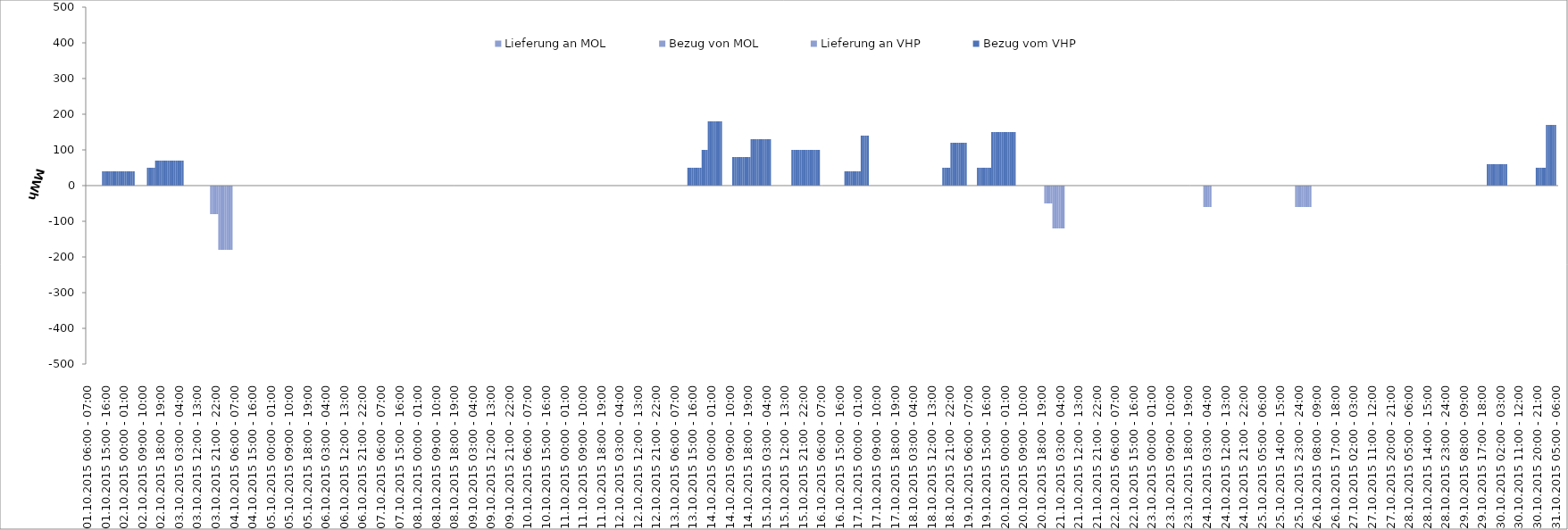
| Category | Bezug vom VHP | Lieferung an VHP | Bezug von MOL | Lieferung an MOL |
|---|---|---|---|---|
| 01.10.2015 06:00 - 07:00 | 0 | 0 | 0 | 0 |
| 01.10.2015 07:00 - 08:00 | 0 | 0 | 0 | 0 |
| 01.10.2015 08:00 - 09:00 | 0 | 0 | 0 | 0 |
| 01.10.2015 09:00 - 10:00 | 0 | 0 | 0 | 0 |
| 01.10.2015 10:00 - 11:00 | 0 | 0 | 0 | 0 |
| 01.10.2015 11:00 - 12:00 | 0 | 0 | 0 | 0 |
| 01.10.2015 12:00 - 13:00 | 0 | 0 | 0 | 0 |
| 01.10.2015 13:00 - 14:00 | 0 | 0 | 0 | 0 |
| 01.10.2015 14:00 - 15:00 | 40 | 0 | 0 | 0 |
| 01.10.2015 15:00 - 16:00 | 40 | 0 | 0 | 0 |
| 01.10.2015 16:00 - 17:00 | 40 | 0 | 0 | 0 |
| 01.10.2015 17:00 - 18:00 | 40 | 0 | 0 | 0 |
| 01.10.2015 18:00 - 19:00 | 40 | 0 | 0 | 0 |
| 01.10.2015 19:00 - 20:00 | 40 | 0 | 0 | 0 |
| 01.10.2015 20:00 - 21:00 | 40 | 0 | 0 | 0 |
| 01.10.2015 21:00 - 22:00 | 40 | 0 | 0 | 0 |
| 01.10.2015 22:00 - 23:00 | 40 | 0 | 0 | 0 |
| 01.10.2015 23:00 - 24:00 | 40 | 0 | 0 | 0 |
| 02.10.2015 00:00 - 01:00 | 40 | 0 | 0 | 0 |
| 02.10.2015 01:00 - 02:00 | 40 | 0 | 0 | 0 |
| 02.10.2015 02:00 - 03:00 | 40 | 0 | 0 | 0 |
| 02.10.2015 03:00 - 04:00 | 40 | 0 | 0 | 0 |
| 02.10.2015 04:00 - 05:00 | 40 | 0 | 0 | 0 |
| 02.10.2015 05:00 - 06:00 | 40 | 0 | 0 | 0 |
| 02.10.2015 06:00 - 07:00 | 0 | 0 | 0 | 0 |
| 02.10.2015 07:00 - 08:00 | 0 | 0 | 0 | 0 |
| 02.10.2015 08:00 - 09:00 | 0 | 0 | 0 | 0 |
| 02.10.2015 09:00 - 10:00 | 0 | 0 | 0 | 0 |
| 02.10.2015 10:00 - 11:00 | 0 | 0 | 0 | 0 |
| 02.10.2015 11:00 - 12:00 | 0 | 0 | 0 | 0 |
| 02.10.2015 12:00 - 13:00 | 50 | 0 | 0 | 0 |
| 02.10.2015 13:00 - 14:00 | 50 | 0 | 0 | 0 |
| 02.10.2015 14:00 - 15:00 | 50 | 0 | 0 | 0 |
| 02.10.2015 15:00 - 16:00 | 50 | 0 | 0 | 0 |
| 02.10.2015 16:00 - 17:00 | 70 | 0 | 0 | 0 |
| 02.10.2015 17:00 - 18:00 | 70 | 0 | 0 | 0 |
| 02.10.2015 18:00 - 19:00 | 70 | 0 | 0 | 0 |
| 02.10.2015 19:00 - 20:00 | 70 | 0 | 0 | 0 |
| 02.10.2015 20:00 - 21:00 | 70 | 0 | 0 | 0 |
| 02.10.2015 21:00 - 22:00 | 70 | 0 | 0 | 0 |
| 02.10.2015 22:00 - 23:00 | 70 | 0 | 0 | 0 |
| 02.10.2015 23:00 - 24:00 | 70 | 0 | 0 | 0 |
| 03.10.2015 00:00 - 01:00 | 70 | 0 | 0 | 0 |
| 03.10.2015 01:00 - 02:00 | 70 | 0 | 0 | 0 |
| 03.10.2015 02:00 - 03:00 | 70 | 0 | 0 | 0 |
| 03.10.2015 03:00 - 04:00 | 70 | 0 | 0 | 0 |
| 03.10.2015 04:00 - 05:00 | 70 | 0 | 0 | 0 |
| 03.10.2015 05:00 - 06:00 | 70 | 0 | 0 | 0 |
| 03.10.2015 06:00 - 07:00 | 0 | 0 | 0 | 0 |
| 03.10.2015 07:00 - 08:00 | 0 | 0 | 0 | 0 |
| 03.10.2015 08:00 - 09:00 | 0 | 0 | 0 | 0 |
| 03.10.2015 09:00 - 10:00 | 0 | 0 | 0 | 0 |
| 03.10.2015 10:00 - 11:00 | 0 | 0 | 0 | 0 |
| 03.10.2015 11:00 - 12:00 | 0 | 0 | 0 | 0 |
| 03.10.2015 12:00 - 13:00 | 0 | 0 | 0 | 0 |
| 03.10.2015 13:00 - 14:00 | 0 | 0 | 0 | 0 |
| 03.10.2015 14:00 - 15:00 | 0 | 0 | 0 | 0 |
| 03.10.2015 15:00 - 16:00 | 0 | 0 | 0 | 0 |
| 03.10.2015 16:00 - 17:00 | 0 | 0 | 0 | 0 |
| 03.10.2015 17:00 - 18:00 | 0 | 0 | 0 | 0 |
| 03.10.2015 18:00 - 19:00 | 0 | 0 | 0 | 0 |
| 03.10.2015 19:00 - 20:00 | 0 | -80 | 0 | 0 |
| 03.10.2015 20:00 - 21:00 | 0 | -80 | 0 | 0 |
| 03.10.2015 21:00 - 22:00 | 0 | -80 | 0 | 0 |
| 03.10.2015 22:00 - 23:00 | 0 | -80 | 0 | 0 |
| 03.10.2015 23:00 - 24:00 | 0 | -180 | 0 | 0 |
| 04.10.2015 00:00 - 01:00 | 0 | -180 | 0 | 0 |
| 04.10.2015 01:00 - 02:00 | 0 | -180 | 0 | 0 |
| 04.10.2015 02:00 - 03:00 | 0 | -180 | 0 | 0 |
| 04.10.2015 03:00 - 04:00 | 0 | -180 | 0 | 0 |
| 04.10.2015 04:00 - 05:00 | 0 | -180 | 0 | 0 |
| 04.10.2015 05:00 - 06:00 | 0 | -180 | 0 | 0 |
| 04.10.2015 06:00 - 07:00 | 0 | 0 | 0 | 0 |
| 04.10.2015 07:00 - 08:00 | 0 | 0 | 0 | 0 |
| 04.10.2015 08:00 - 09:00 | 0 | 0 | 0 | 0 |
| 04.10.2015 09:00 - 10:00 | 0 | 0 | 0 | 0 |
| 04.10.2015 10:00 - 11:00 | 0 | 0 | 0 | 0 |
| 04.10.2015 11:00 - 12:00 | 0 | 0 | 0 | 0 |
| 04.10.2015 12:00 - 13:00 | 0 | 0 | 0 | 0 |
| 04.10.2015 13:00 - 14:00 | 0 | 0 | 0 | 0 |
| 04.10.2015 14:00 - 15:00 | 0 | 0 | 0 | 0 |
| 04.10.2015 15:00 - 16:00 | 0 | 0 | 0 | 0 |
| 04.10.2015 16:00 - 17:00 | 0 | 0 | 0 | 0 |
| 04.10.2015 17:00 - 18:00 | 0 | 0 | 0 | 0 |
| 04.10.2015 18:00 - 19:00 | 0 | 0 | 0 | 0 |
| 04.10.2015 19:00 - 20:00 | 0 | 0 | 0 | 0 |
| 04.10.2015 20:00 - 21:00 | 0 | 0 | 0 | 0 |
| 04.10.2015 21:00 - 22:00 | 0 | 0 | 0 | 0 |
| 04.10.2015 22:00 - 23:00 | 0 | 0 | 0 | 0 |
| 04.10.2015 23:00 - 24:00 | 0 | 0 | 0 | 0 |
| 05.10.2015 00:00 - 01:00 | 0 | 0 | 0 | 0 |
| 05.10.2015 01:00 - 02:00 | 0 | 0 | 0 | 0 |
| 05.10.2015 02:00 - 03:00 | 0 | 0 | 0 | 0 |
| 05.10.2015 03:00 - 04:00 | 0 | 0 | 0 | 0 |
| 05.10.2015 04:00 - 05:00 | 0 | 0 | 0 | 0 |
| 05.10.2015 05:00 - 06:00 | 0 | 0 | 0 | 0 |
| 05.10.2015 06:00 - 07:00 | 0 | 0 | 0 | 0 |
| 05.10.2015 07:00 - 08:00 | 0 | 0 | 0 | 0 |
| 05.10.2015 08:00 - 09:00 | 0 | 0 | 0 | 0 |
| 05.10.2015 09:00 - 10:00 | 0 | 0 | 0 | 0 |
| 05.10.2015 10:00 - 11:00 | 0 | 0 | 0 | 0 |
| 05.10.2015 11:00 - 12:00 | 0 | 0 | 0 | 0 |
| 05.10.2015 12:00 - 13:00 | 0 | 0 | 0 | 0 |
| 05.10.2015 13:00 - 14:00 | 0 | 0 | 0 | 0 |
| 05.10.2015 14:00 - 15:00 | 0 | 0 | 0 | 0 |
| 05.10.2015 15:00 - 16:00 | 0 | 0 | 0 | 0 |
| 05.10.2015 16:00 - 17:00 | 0 | 0 | 0 | 0 |
| 05.10.2015 17:00 - 18:00 | 0 | 0 | 0 | 0 |
| 05.10.2015 18:00 - 19:00 | 0 | 0 | 0 | 0 |
| 05.10.2015 19:00 - 20:00 | 0 | 0 | 0 | 0 |
| 05.10.2015 20:00 - 21:00 | 0 | 0 | 0 | 0 |
| 05.10.2015 21:00 - 22:00 | 0 | 0 | 0 | 0 |
| 05.10.2015 22:00 - 23:00 | 0 | 0 | 0 | 0 |
| 05.10.2015 23:00 - 24:00 | 0 | 0 | 0 | 0 |
| 06.10.2015 00:00 - 01:00 | 0 | 0 | 0 | 0 |
| 06.10.2015 01:00 - 02:00 | 0 | 0 | 0 | 0 |
| 06.10.2015 02:00 - 03:00 | 0 | 0 | 0 | 0 |
| 06.10.2015 03:00 - 04:00 | 0 | 0 | 0 | 0 |
| 06.10.2015 04:00 - 05:00 | 0 | 0 | 0 | 0 |
| 06.10.2015 05:00 - 06:00 | 0 | 0 | 0 | 0 |
| 06.10.2015 06:00 - 07:00 | 0 | 0 | 0 | 0 |
| 06.10.2015 07:00 - 08:00 | 0 | 0 | 0 | 0 |
| 06.10.2015 08:00 - 09:00 | 0 | 0 | 0 | 0 |
| 06.10.2015 09:00 - 10:00 | 0 | 0 | 0 | 0 |
| 06.10.2015 10:00 - 11:00 | 0 | 0 | 0 | 0 |
| 06.10.2015 11:00 - 12:00 | 0 | 0 | 0 | 0 |
| 06.10.2015 12:00 - 13:00 | 0 | 0 | 0 | 0 |
| 06.10.2015 13:00 - 14:00 | 0 | 0 | 0 | 0 |
| 06.10.2015 14:00 - 15:00 | 0 | 0 | 0 | 0 |
| 06.10.2015 15:00 - 16:00 | 0 | 0 | 0 | 0 |
| 06.10.2015 16:00 - 17:00 | 0 | 0 | 0 | 0 |
| 06.10.2015 17:00 - 18:00 | 0 | 0 | 0 | 0 |
| 06.10.2015 18:00 - 19:00 | 0 | 0 | 0 | 0 |
| 06.10.2015 19:00 - 20:00 | 0 | 0 | 0 | 0 |
| 06.10.2015 20:00 - 21:00 | 0 | 0 | 0 | 0 |
| 06.10.2015 21:00 - 22:00 | 0 | 0 | 0 | 0 |
| 06.10.2015 22:00 - 23:00 | 0 | 0 | 0 | 0 |
| 06.10.2015 23:00 - 24:00 | 0 | 0 | 0 | 0 |
| 07.10.2015 00:00 - 01:00 | 0 | 0 | 0 | 0 |
| 07.10.2015 01:00 - 02:00 | 0 | 0 | 0 | 0 |
| 07.10.2015 02:00 - 03:00 | 0 | 0 | 0 | 0 |
| 07.10.2015 03:00 - 04:00 | 0 | 0 | 0 | 0 |
| 07.10.2015 04:00 - 05:00 | 0 | 0 | 0 | 0 |
| 07.10.2015 05:00 - 06:00 | 0 | 0 | 0 | 0 |
| 07.10.2015 06:00 - 07:00 | 0 | 0 | 0 | 0 |
| 07.10.2015 07:00 - 08:00 | 0 | 0 | 0 | 0 |
| 07.10.2015 08:00 - 09:00 | 0 | 0 | 0 | 0 |
| 07.10.2015 09:00 - 10:00 | 0 | 0 | 0 | 0 |
| 07.10.2015 10:00 - 11:00 | 0 | 0 | 0 | 0 |
| 07.10.2015 11:00 - 12:00 | 0 | 0 | 0 | 0 |
| 07.10.2015 12:00 - 13:00 | 0 | 0 | 0 | 0 |
| 07.10.2015 13:00 - 14:00 | 0 | 0 | 0 | 0 |
| 07.10.2015 14:00 - 15:00 | 0 | 0 | 0 | 0 |
| 07.10.2015 15:00 - 16:00 | 0 | 0 | 0 | 0 |
| 07.10.2015 16:00 - 17:00 | 0 | 0 | 0 | 0 |
| 07.10.2015 17:00 - 18:00 | 0 | 0 | 0 | 0 |
| 07.10.2015 18:00 - 19:00 | 0 | 0 | 0 | 0 |
| 07.10.2015 19:00 - 20:00 | 0 | 0 | 0 | 0 |
| 07.10.2015 20:00 - 21:00 | 0 | 0 | 0 | 0 |
| 07.10.2015 21:00 - 22:00 | 0 | 0 | 0 | 0 |
| 07.10.2015 22:00 - 23:00 | 0 | 0 | 0 | 0 |
| 07.10.2015 23:00 - 24:00 | 0 | 0 | 0 | 0 |
| 08.10.2015 00:00 - 01:00 | 0 | 0 | 0 | 0 |
| 08.10.2015 01:00 - 02:00 | 0 | 0 | 0 | 0 |
| 08.10.2015 02:00 - 03:00 | 0 | 0 | 0 | 0 |
| 08.10.2015 03:00 - 04:00 | 0 | 0 | 0 | 0 |
| 08.10.2015 04:00 - 05:00 | 0 | 0 | 0 | 0 |
| 08.10.2015 05:00 - 06:00 | 0 | 0 | 0 | 0 |
| 08.10.2015 06:00 - 07:00 | 0 | 0 | 0 | 0 |
| 08.10.2015 07:00 - 08:00 | 0 | 0 | 0 | 0 |
| 08.10.2015 08:00 - 09:00 | 0 | 0 | 0 | 0 |
| 08.10.2015 09:00 - 10:00 | 0 | 0 | 0 | 0 |
| 08.10.2015 10:00 - 11:00 | 0 | 0 | 0 | 0 |
| 08.10.2015 11:00 - 12:00 | 0 | 0 | 0 | 0 |
| 08.10.2015 12:00 - 13:00 | 0 | 0 | 0 | 0 |
| 08.10.2015 13:00 - 14:00 | 0 | 0 | 0 | 0 |
| 08.10.2015 14:00 - 15:00 | 0 | 0 | 0 | 0 |
| 08.10.2015 15:00 - 16:00 | 0 | 0 | 0 | 0 |
| 08.10.2015 16:00 - 17:00 | 0 | 0 | 0 | 0 |
| 08.10.2015 17:00 - 18:00 | 0 | 0 | 0 | 0 |
| 08.10.2015 18:00 - 19:00 | 0 | 0 | 0 | 0 |
| 08.10.2015 19:00 - 20:00 | 0 | 0 | 0 | 0 |
| 08.10.2015 20:00 - 21:00 | 0 | 0 | 0 | 0 |
| 08.10.2015 21:00 - 22:00 | 0 | 0 | 0 | 0 |
| 08.10.2015 22:00 - 23:00 | 0 | 0 | 0 | 0 |
| 08.10.2015 23:00 - 24:00 | 0 | 0 | 0 | 0 |
| 09.10.2015 00:00 - 01:00 | 0 | 0 | 0 | 0 |
| 09.10.2015 01:00 - 02:00 | 0 | 0 | 0 | 0 |
| 09.10.2015 02:00 - 03:00 | 0 | 0 | 0 | 0 |
| 09.10.2015 03:00 - 04:00 | 0 | 0 | 0 | 0 |
| 09.10.2015 04:00 - 05:00 | 0 | 0 | 0 | 0 |
| 09.10.2015 05:00 - 06:00 | 0 | 0 | 0 | 0 |
| 09.10.2015 06:00 - 07:00 | 0 | 0 | 0 | 0 |
| 09.10.2015 07:00 - 08:00 | 0 | 0 | 0 | 0 |
| 09.10.2015 08:00 - 09:00 | 0 | 0 | 0 | 0 |
| 09.10.2015 09:00 - 10:00 | 0 | 0 | 0 | 0 |
| 09.10.2015 10:00 - 11:00 | 0 | 0 | 0 | 0 |
| 09.10.2015 11:00 - 12:00 | 0 | 0 | 0 | 0 |
| 09.10.2015 12:00 - 13:00 | 0 | 0 | 0 | 0 |
| 09.10.2015 13:00 - 14:00 | 0 | 0 | 0 | 0 |
| 09.10.2015 14:00 - 15:00 | 0 | 0 | 0 | 0 |
| 09.10.2015 15:00 - 16:00 | 0 | 0 | 0 | 0 |
| 09.10.2015 16:00 - 17:00 | 0 | 0 | 0 | 0 |
| 09.10.2015 17:00 - 18:00 | 0 | 0 | 0 | 0 |
| 09.10.2015 18:00 - 19:00 | 0 | 0 | 0 | 0 |
| 09.10.2015 19:00 - 20:00 | 0 | 0 | 0 | 0 |
| 09.10.2015 20:00 - 21:00 | 0 | 0 | 0 | 0 |
| 09.10.2015 21:00 - 22:00 | 0 | 0 | 0 | 0 |
| 09.10.2015 22:00 - 23:00 | 0 | 0 | 0 | 0 |
| 09.10.2015 23:00 - 24:00 | 0 | 0 | 0 | 0 |
| 10.10.2015 00:00 - 01:00 | 0 | 0 | 0 | 0 |
| 10.10.2015 01:00 - 02:00 | 0 | 0 | 0 | 0 |
| 10.10.2015 02:00 - 03:00 | 0 | 0 | 0 | 0 |
| 10.10.2015 03:00 - 04:00 | 0 | 0 | 0 | 0 |
| 10.10.2015 04:00 - 05:00 | 0 | 0 | 0 | 0 |
| 10.10.2015 05:00 - 06:00 | 0 | 0 | 0 | 0 |
| 10.10.2015 06:00 - 07:00 | 0 | 0 | 0 | 0 |
| 10.10.2015 07:00 - 08:00 | 0 | 0 | 0 | 0 |
| 10.10.2015 08:00 - 09:00 | 0 | 0 | 0 | 0 |
| 10.10.2015 09:00 - 10:00 | 0 | 0 | 0 | 0 |
| 10.10.2015 10:00 - 11:00 | 0 | 0 | 0 | 0 |
| 10.10.2015 11:00 - 12:00 | 0 | 0 | 0 | 0 |
| 10.10.2015 12:00 - 13:00 | 0 | 0 | 0 | 0 |
| 10.10.2015 13:00 - 14:00 | 0 | 0 | 0 | 0 |
| 10.10.2015 14:00 - 15:00 | 0 | 0 | 0 | 0 |
| 10.10.2015 15:00 - 16:00 | 0 | 0 | 0 | 0 |
| 10.10.2015 16:00 - 17:00 | 0 | 0 | 0 | 0 |
| 10.10.2015 17:00 - 18:00 | 0 | 0 | 0 | 0 |
| 10.10.2015 18:00 - 19:00 | 0 | 0 | 0 | 0 |
| 10.10.2015 19:00 - 20:00 | 0 | 0 | 0 | 0 |
| 10.10.2015 20:00 - 21:00 | 0 | 0 | 0 | 0 |
| 10.10.2015 21:00 - 22:00 | 0 | 0 | 0 | 0 |
| 10.10.2015 22:00 - 23:00 | 0 | 0 | 0 | 0 |
| 10.10.2015 23:00 - 24:00 | 0 | 0 | 0 | 0 |
| 11.10.2015 00:00 - 01:00 | 0 | 0 | 0 | 0 |
| 11.10.2015 01:00 - 02:00 | 0 | 0 | 0 | 0 |
| 11.10.2015 02:00 - 03:00 | 0 | 0 | 0 | 0 |
| 11.10.2015 03:00 - 04:00 | 0 | 0 | 0 | 0 |
| 11.10.2015 04:00 - 05:00 | 0 | 0 | 0 | 0 |
| 11.10.2015 05:00 - 06:00 | 0 | 0 | 0 | 0 |
| 11.10.2015 06:00 - 07:00 | 0 | 0 | 0 | 0 |
| 11.10.2015 07:00 - 08:00 | 0 | 0 | 0 | 0 |
| 11.10.2015 08:00 - 09:00 | 0 | 0 | 0 | 0 |
| 11.10.2015 09:00 - 10:00 | 0 | 0 | 0 | 0 |
| 11.10.2015 10:00 - 11:00 | 0 | 0 | 0 | 0 |
| 11.10.2015 11:00 - 12:00 | 0 | 0 | 0 | 0 |
| 11.10.2015 12:00 - 13:00 | 0 | 0 | 0 | 0 |
| 11.10.2015 13:00 - 14:00 | 0 | 0 | 0 | 0 |
| 11.10.2015 14:00 - 15:00 | 0 | 0 | 0 | 0 |
| 11.10.2015 15:00 - 16:00 | 0 | 0 | 0 | 0 |
| 11.10.2015 16:00 - 17:00 | 0 | 0 | 0 | 0 |
| 11.10.2015 17:00 - 18:00 | 0 | 0 | 0 | 0 |
| 11.10.2015 18:00 - 19:00 | 0 | 0 | 0 | 0 |
| 11.10.2015 19:00 - 20:00 | 0 | 0 | 0 | 0 |
| 11.10.2015 20:00 - 21:00 | 0 | 0 | 0 | 0 |
| 11.10.2015 21:00 - 22:00 | 0 | 0 | 0 | 0 |
| 11.10.2015 22:00 - 23:00 | 0 | 0 | 0 | 0 |
| 11.10.2015 23:00 - 24:00 | 0 | 0 | 0 | 0 |
| 12.10.2015 00:00 - 01:00 | 0 | 0 | 0 | 0 |
| 12.10.2015 01:00 - 02:00 | 0 | 0 | 0 | 0 |
| 12.10.2015 02:00 - 03:00 | 0 | 0 | 0 | 0 |
| 12.10.2015 03:00 - 04:00 | 0 | 0 | 0 | 0 |
| 12.10.2015 04:00 - 05:00 | 0 | 0 | 0 | 0 |
| 12.10.2015 05:00 - 06:00 | 0 | 0 | 0 | 0 |
| 12.10.2015 06:00 - 07:00 | 0 | 0 | 0 | 0 |
| 12.10.2015 07:00 - 08:00 | 0 | 0 | 0 | 0 |
| 12.10.2015 08:00 - 09:00 | 0 | 0 | 0 | 0 |
| 12.10.2015 09:00 - 10:00 | 0 | 0 | 0 | 0 |
| 12.10.2015 10:00 - 11:00 | 0 | 0 | 0 | 0 |
| 12.10.2015 11:00 - 12:00 | 0 | 0 | 0 | 0 |
| 12.10.2015 12:00 - 13:00 | 0 | 0 | 0 | 0 |
| 12.10.2015 13:00 - 14:00 | 0 | 0 | 0 | 0 |
| 12.10.2015 14:00 - 15:00 | 0 | 0 | 0 | 0 |
| 12.10.2015 15:00 - 16:00 | 0 | 0 | 0 | 0 |
| 12.10.2015 16:00 - 17:00 | 0 | 0 | 0 | 0 |
| 12.10.2015 17:00 - 18:00 | 0 | 0 | 0 | 0 |
| 12.10.2015 18:00 - 19:00 | 0 | 0 | 0 | 0 |
| 12.10.2015 19:00 - 20:00 | 0 | 0 | 0 | 0 |
| 12.10.2015 20:00 - 21:00 | 0 | 0 | 0 | 0 |
| 12.10.2015 21:00 - 22:00 | 0 | 0 | 0 | 0 |
| 12.10.2015 22:00 - 23:00 | 0 | 0 | 0 | 0 |
| 12.10.2015 23:00 - 24:00 | 0 | 0 | 0 | 0 |
| 13.10.2015 00:00 - 01:00 | 0 | 0 | 0 | 0 |
| 13.10.2015 01:00 - 02:00 | 0 | 0 | 0 | 0 |
| 13.10.2015 02:00 - 03:00 | 0 | 0 | 0 | 0 |
| 13.10.2015 03:00 - 04:00 | 0 | 0 | 0 | 0 |
| 13.10.2015 04:00 - 05:00 | 0 | 0 | 0 | 0 |
| 13.10.2015 05:00 - 06:00 | 0 | 0 | 0 | 0 |
| 13.10.2015 06:00 - 07:00 | 0 | 0 | 0 | 0 |
| 13.10.2015 07:00 - 08:00 | 0 | 0 | 0 | 0 |
| 13.10.2015 08:00 - 09:00 | 0 | 0 | 0 | 0 |
| 13.10.2015 09:00 - 10:00 | 0 | 0 | 0 | 0 |
| 13.10.2015 10:00 - 11:00 | 0 | 0 | 0 | 0 |
| 13.10.2015 11:00 - 12:00 | 0 | 0 | 0 | 0 |
| 13.10.2015 12:00 - 13:00 | 0 | 0 | 0 | 0 |
| 13.10.2015 13:00 - 14:00 | 50 | 0 | 0 | 0 |
| 13.10.2015 14:00 - 15:00 | 50 | 0 | 0 | 0 |
| 13.10.2015 15:00 - 16:00 | 50 | 0 | 0 | 0 |
| 13.10.2015 16:00 - 17:00 | 50 | 0 | 0 | 0 |
| 13.10.2015 17:00 - 18:00 | 50 | 0 | 0 | 0 |
| 13.10.2015 18:00 - 19:00 | 50 | 0 | 0 | 0 |
| 13.10.2015 19:00 - 20:00 | 50 | 0 | 0 | 0 |
| 13.10.2015 20:00 - 21:00 | 100 | 0 | 0 | 0 |
| 13.10.2015 21:00 - 22:00 | 100 | 0 | 0 | 0 |
| 13.10.2015 22:00 - 23:00 | 100 | 0 | 0 | 0 |
| 13.10.2015 23:00 - 24:00 | 180 | 0 | 0 | 0 |
| 14.10.2015 00:00 - 01:00 | 180 | 0 | 0 | 0 |
| 14.10.2015 01:00 - 02:00 | 180 | 0 | 0 | 0 |
| 14.10.2015 02:00 - 03:00 | 180 | 0 | 0 | 0 |
| 14.10.2015 03:00 - 04:00 | 180 | 0 | 0 | 0 |
| 14.10.2015 04:00 - 05:00 | 180 | 0 | 0 | 0 |
| 14.10.2015 05:00 - 06:00 | 180 | 0 | 0 | 0 |
| 14.10.2015 06:00 - 07:00 | 0 | 0 | 0 | 0 |
| 14.10.2015 07:00 - 08:00 | 0 | 0 | 0 | 0 |
| 14.10.2015 08:00 - 09:00 | 0 | 0 | 0 | 0 |
| 14.10.2015 09:00 - 10:00 | 0 | 0 | 0 | 0 |
| 14.10.2015 10:00 - 11:00 | 0 | 0 | 0 | 0 |
| 14.10.2015 11:00 - 12:00 | 80 | 0 | 0 | 0 |
| 14.10.2015 12:00 - 13:00 | 80 | 0 | 0 | 0 |
| 14.10.2015 13:00 - 14:00 | 80 | 0 | 0 | 0 |
| 14.10.2015 14:00 - 15:00 | 80 | 0 | 0 | 0 |
| 14.10.2015 15:00 - 16:00 | 80 | 0 | 0 | 0 |
| 14.10.2015 16:00 - 17:00 | 80 | 0 | 0 | 0 |
| 14.10.2015 17:00 - 18:00 | 80 | 0 | 0 | 0 |
| 14.10.2015 18:00 - 19:00 | 80 | 0 | 0 | 0 |
| 14.10.2015 19:00 - 20:00 | 80 | 0 | 0 | 0 |
| 14.10.2015 20:00 - 21:00 | 130 | 0 | 0 | 0 |
| 14.10.2015 21:00 - 22:00 | 130 | 0 | 0 | 0 |
| 14.10.2015 22:00 - 23:00 | 130 | 0 | 0 | 0 |
| 14.10.2015 23:00 - 24:00 | 130 | 0 | 0 | 0 |
| 15.10.2015 00:00 - 01:00 | 130 | 0 | 0 | 0 |
| 15.10.2015 01:00 - 02:00 | 130 | 0 | 0 | 0 |
| 15.10.2015 02:00 - 03:00 | 130 | 0 | 0 | 0 |
| 15.10.2015 03:00 - 04:00 | 130 | 0 | 0 | 0 |
| 15.10.2015 04:00 - 05:00 | 130 | 0 | 0 | 0 |
| 15.10.2015 05:00 - 06:00 | 130 | 0 | 0 | 0 |
| 15.10.2015 06:00 - 07:00 | 0 | 0 | 0 | 0 |
| 15.10.2015 07:00 - 08:00 | 0 | 0 | 0 | 0 |
| 15.10.2015 08:00 - 09:00 | 0 | 0 | 0 | 0 |
| 15.10.2015 09:00 - 10:00 | 0 | 0 | 0 | 0 |
| 15.10.2015 10:00 - 11:00 | 0 | 0 | 0 | 0 |
| 15.10.2015 11:00 - 12:00 | 0 | 0 | 0 | 0 |
| 15.10.2015 12:00 - 13:00 | 0 | 0 | 0 | 0 |
| 15.10.2015 13:00 - 14:00 | 0 | 0 | 0 | 0 |
| 15.10.2015 14:00 - 15:00 | 0 | 0 | 0 | 0 |
| 15.10.2015 15:00 - 16:00 | 0 | 0 | 0 | 0 |
| 15.10.2015 16:00 - 17:00 | 100 | 0 | 0 | 0 |
| 15.10.2015 17:00 - 18:00 | 100 | 0 | 0 | 0 |
| 15.10.2015 18:00 - 19:00 | 100 | 0 | 0 | 0 |
| 15.10.2015 19:00 - 20:00 | 100 | 0 | 0 | 0 |
| 15.10.2015 20:00 - 21:00 | 100 | 0 | 0 | 0 |
| 15.10.2015 21:00 - 22:00 | 100 | 0 | 0 | 0 |
| 15.10.2015 22:00 - 23:00 | 100 | 0 | 0 | 0 |
| 15.10.2015 23:00 - 24:00 | 100 | 0 | 0 | 0 |
| 16.10.2015 00:00 - 01:00 | 100 | 0 | 0 | 0 |
| 16.10.2015 01:00 - 02:00 | 100 | 0 | 0 | 0 |
| 16.10.2015 02:00 - 03:00 | 100 | 0 | 0 | 0 |
| 16.10.2015 03:00 - 04:00 | 100 | 0 | 0 | 0 |
| 16.10.2015 04:00 - 05:00 | 100 | 0 | 0 | 0 |
| 16.10.2015 05:00 - 06:00 | 100 | 0 | 0 | 0 |
| 16.10.2015 06:00 - 07:00 | 0 | 0 | 0 | 0 |
| 16.10.2015 07:00 - 08:00 | 0 | 0 | 0 | 0 |
| 16.10.2015 08:00 - 09:00 | 0 | 0 | 0 | 0 |
| 16.10.2015 09:00 - 10:00 | 0 | 0 | 0 | 0 |
| 16.10.2015 10:00 - 11:00 | 0 | 0 | 0 | 0 |
| 16.10.2015 11:00 - 12:00 | 0 | 0 | 0 | 0 |
| 16.10.2015 12:00 - 13:00 | 0 | 0 | 0 | 0 |
| 16.10.2015 13:00 - 14:00 | 0 | 0 | 0 | 0 |
| 16.10.2015 14:00 - 15:00 | 0 | 0 | 0 | 0 |
| 16.10.2015 15:00 - 16:00 | 0 | 0 | 0 | 0 |
| 16.10.2015 16:00 - 17:00 | 0 | 0 | 0 | 0 |
| 16.10.2015 17:00 - 18:00 | 0 | 0 | 0 | 0 |
| 16.10.2015 18:00 - 19:00 | 40 | 0 | 0 | 0 |
| 16.10.2015 19:00 - 20:00 | 40 | 0 | 0 | 0 |
| 16.10.2015 20:00 - 21:00 | 40 | 0 | 0 | 0 |
| 16.10.2015 21:00 - 22:00 | 40 | 0 | 0 | 0 |
| 16.10.2015 22:00 - 23:00 | 40 | 0 | 0 | 0 |
| 16.10.2015 23:00 - 24:00 | 40 | 0 | 0 | 0 |
| 17.10.2015 00:00 - 01:00 | 40 | 0 | 0 | 0 |
| 17.10.2015 01:00 - 02:00 | 40 | 0 | 0 | 0 |
| 17.10.2015 02:00 - 03:00 | 140 | 0 | 0 | 0 |
| 17.10.2015 03:00 - 04:00 | 140 | 0 | 0 | 0 |
| 17.10.2015 04:00 - 05:00 | 140 | 0 | 0 | 0 |
| 17.10.2015 05:00 - 06:00 | 140 | 0 | 0 | 0 |
| 17.10.2015 06:00 - 07:00 | 0 | 0 | 0 | 0 |
| 17.10.2015 07:00 - 08:00 | 0 | 0 | 0 | 0 |
| 17.10.2015 08:00 - 09:00 | 0 | 0 | 0 | 0 |
| 17.10.2015 09:00 - 10:00 | 0 | 0 | 0 | 0 |
| 17.10.2015 10:00 - 11:00 | 0 | 0 | 0 | 0 |
| 17.10.2015 11:00 - 12:00 | 0 | 0 | 0 | 0 |
| 17.10.2015 12:00 - 13:00 | 0 | 0 | 0 | 0 |
| 17.10.2015 13:00 - 14:00 | 0 | 0 | 0 | 0 |
| 17.10.2015 14:00 - 15:00 | 0 | 0 | 0 | 0 |
| 17.10.2015 15:00 - 16:00 | 0 | 0 | 0 | 0 |
| 17.10.2015 16:00 - 17:00 | 0 | 0 | 0 | 0 |
| 17.10.2015 17:00 - 18:00 | 0 | 0 | 0 | 0 |
| 17.10.2015 18:00 - 19:00 | 0 | 0 | 0 | 0 |
| 17.10.2015 19:00 - 20:00 | 0 | 0 | 0 | 0 |
| 17.10.2015 20:00 - 21:00 | 0 | 0 | 0 | 0 |
| 17.10.2015 21:00 - 22:00 | 0 | 0 | 0 | 0 |
| 17.10.2015 22:00 - 23:00 | 0 | 0 | 0 | 0 |
| 17.10.2015 23:00 - 24:00 | 0 | 0 | 0 | 0 |
| 18.10.2015 00:00 - 01:00 | 0 | 0 | 0 | 0 |
| 18.10.2015 01:00 - 02:00 | 0 | 0 | 0 | 0 |
| 18.10.2015 02:00 - 03:00 | 0 | 0 | 0 | 0 |
| 18.10.2015 03:00 - 04:00 | 0 | 0 | 0 | 0 |
| 18.10.2015 04:00 - 05:00 | 0 | 0 | 0 | 0 |
| 18.10.2015 05:00 - 06:00 | 0 | 0 | 0 | 0 |
| 18.10.2015 06:00 - 07:00 | 0 | 0 | 0 | 0 |
| 18.10.2015 07:00 - 08:00 | 0 | 0 | 0 | 0 |
| 18.10.2015 08:00 - 09:00 | 0 | 0 | 0 | 0 |
| 18.10.2015 09:00 - 10:00 | 0 | 0 | 0 | 0 |
| 18.10.2015 10:00 - 11:00 | 0 | 0 | 0 | 0 |
| 18.10.2015 11:00 - 12:00 | 0 | 0 | 0 | 0 |
| 18.10.2015 12:00 - 13:00 | 0 | 0 | 0 | 0 |
| 18.10.2015 13:00 - 14:00 | 0 | 0 | 0 | 0 |
| 18.10.2015 14:00 - 15:00 | 0 | 0 | 0 | 0 |
| 18.10.2015 15:00 - 16:00 | 0 | 0 | 0 | 0 |
| 18.10.2015 16:00 - 17:00 | 0 | 0 | 0 | 0 |
| 18.10.2015 17:00 - 18:00 | 0 | 0 | 0 | 0 |
| 18.10.2015 18:00 - 19:00 | 50 | 0 | 0 | 0 |
| 18.10.2015 19:00 - 20:00 | 50 | 0 | 0 | 0 |
| 18.10.2015 20:00 - 21:00 | 50 | 0 | 0 | 0 |
| 18.10.2015 21:00 - 22:00 | 50 | 0 | 0 | 0 |
| 18.10.2015 22:00 - 23:00 | 120 | 0 | 0 | 0 |
| 18.10.2015 23:00 - 24:00 | 120 | 0 | 0 | 0 |
| 19.10.2015 00:00 - 01:00 | 120 | 0 | 0 | 0 |
| 19.10.2015 01:00 - 02:00 | 120 | 0 | 0 | 0 |
| 19.10.2015 02:00 - 03:00 | 120 | 0 | 0 | 0 |
| 19.10.2015 03:00 - 04:00 | 120 | 0 | 0 | 0 |
| 19.10.2015 04:00 - 05:00 | 120 | 0 | 0 | 0 |
| 19.10.2015 05:00 - 06:00 | 120 | 0 | 0 | 0 |
| 19.10.2015 06:00 - 07:00 | 0 | 0 | 0 | 0 |
| 19.10.2015 07:00 - 08:00 | 0 | 0 | 0 | 0 |
| 19.10.2015 08:00 - 09:00 | 0 | 0 | 0 | 0 |
| 19.10.2015 09:00 - 10:00 | 0 | 0 | 0 | 0 |
| 19.10.2015 10:00 - 11:00 | 0 | 0 | 0 | 0 |
| 19.10.2015 11:00 - 12:00 | 50 | 0 | 0 | 0 |
| 19.10.2015 12:00 - 13:00 | 50 | 0 | 0 | 0 |
| 19.10.2015 13:00 - 14:00 | 50 | 0 | 0 | 0 |
| 19.10.2015 14:00 - 15:00 | 50 | 0 | 0 | 0 |
| 19.10.2015 15:00 - 16:00 | 50 | 0 | 0 | 0 |
| 19.10.2015 16:00 - 17:00 | 50 | 0 | 0 | 0 |
| 19.10.2015 17:00 - 18:00 | 50 | 0 | 0 | 0 |
| 19.10.2015 18:00 - 19:00 | 150 | 0 | 0 | 0 |
| 19.10.2015 19:00 - 20:00 | 150 | 0 | 0 | 0 |
| 19.10.2015 20:00 - 21:00 | 150 | 0 | 0 | 0 |
| 19.10.2015 21:00 - 22:00 | 150 | 0 | 0 | 0 |
| 19.10.2015 22:00 - 23:00 | 150 | 0 | 0 | 0 |
| 19.10.2015 23:00 - 24:00 | 150 | 0 | 0 | 0 |
| 20.10.2015 00:00 - 01:00 | 150 | 0 | 0 | 0 |
| 20.10.2015 01:00 - 02:00 | 150 | 0 | 0 | 0 |
| 20.10.2015 02:00 - 03:00 | 150 | 0 | 0 | 0 |
| 20.10.2015 03:00 - 04:00 | 150 | 0 | 0 | 0 |
| 20.10.2015 04:00 - 05:00 | 150 | 0 | 0 | 0 |
| 20.10.2015 05:00 - 06:00 | 150 | 0 | 0 | 0 |
| 20.10.2015 06:00 - 07:00 | 0 | 0 | 0 | 0 |
| 20.10.2015 07:00 - 08:00 | 0 | 0 | 0 | 0 |
| 20.10.2015 08:00 - 09:00 | 0 | 0 | 0 | 0 |
| 20.10.2015 09:00 - 10:00 | 0 | 0 | 0 | 0 |
| 20.10.2015 10:00 - 11:00 | 0 | 0 | 0 | 0 |
| 20.10.2015 11:00 - 12:00 | 0 | 0 | 0 | 0 |
| 20.10.2015 12:00 - 13:00 | 0 | 0 | 0 | 0 |
| 20.10.2015 13:00 - 14:00 | 0 | 0 | 0 | 0 |
| 20.10.2015 14:00 - 15:00 | 0 | 0 | 0 | 0 |
| 20.10.2015 15:00 - 16:00 | 0 | 0 | 0 | 0 |
| 20.10.2015 16:00 - 17:00 | 0 | 0 | 0 | 0 |
| 20.10.2015 17:00 - 18:00 | 0 | 0 | 0 | 0 |
| 20.10.2015 18:00 - 19:00 | 0 | 0 | 0 | 0 |
| 20.10.2015 19:00 - 20:00 | 0 | 0 | 0 | 0 |
| 20.10.2015 20:00 - 21:00 | 0 | -50 | 0 | 0 |
| 20.10.2015 21:00 - 22:00 | 0 | -50 | 0 | 0 |
| 20.10.2015 22:00 - 23:00 | 0 | -50 | 0 | 0 |
| 20.10.2015 23:00 - 24:00 | 0 | -50 | 0 | 0 |
| 21.10.2015 00:00 - 01:00 | 0 | -120 | 0 | 0 |
| 21.10.2015 01:00 - 02:00 | 0 | -120 | 0 | 0 |
| 21.10.2015 02:00 - 03:00 | 0 | -120 | 0 | 0 |
| 21.10.2015 03:00 - 04:00 | 0 | -120 | 0 | 0 |
| 21.10.2015 04:00 - 05:00 | 0 | -120 | 0 | 0 |
| 21.10.2015 05:00 - 06:00 | 0 | -120 | 0 | 0 |
| 21.10.2015 06:00 - 07:00 | 0 | 0 | 0 | 0 |
| 21.10.2015 07:00 - 08:00 | 0 | 0 | 0 | 0 |
| 21.10.2015 08:00 - 09:00 | 0 | 0 | 0 | 0 |
| 21.10.2015 09:00 - 10:00 | 0 | 0 | 0 | 0 |
| 21.10.2015 10:00 - 11:00 | 0 | 0 | 0 | 0 |
| 21.10.2015 11:00 - 12:00 | 0 | 0 | 0 | 0 |
| 21.10.2015 12:00 - 13:00 | 0 | 0 | 0 | 0 |
| 21.10.2015 13:00 - 14:00 | 0 | 0 | 0 | 0 |
| 21.10.2015 14:00 - 15:00 | 0 | 0 | 0 | 0 |
| 21.10.2015 15:00 - 16:00 | 0 | 0 | 0 | 0 |
| 21.10.2015 16:00 - 17:00 | 0 | 0 | 0 | 0 |
| 21.10.2015 17:00 - 18:00 | 0 | 0 | 0 | 0 |
| 21.10.2015 18:00 - 19:00 | 0 | 0 | 0 | 0 |
| 21.10.2015 19:00 - 20:00 | 0 | 0 | 0 | 0 |
| 21.10.2015 20:00 - 21:00 | 0 | 0 | 0 | 0 |
| 21.10.2015 21:00 - 22:00 | 0 | 0 | 0 | 0 |
| 21.10.2015 22:00 - 23:00 | 0 | 0 | 0 | 0 |
| 21.10.2015 23:00 - 24:00 | 0 | 0 | 0 | 0 |
| 22.10.2015 00:00 - 01:00 | 0 | 0 | 0 | 0 |
| 22.10.2015 01:00 - 02:00 | 0 | 0 | 0 | 0 |
| 22.10.2015 02:00 - 03:00 | 0 | 0 | 0 | 0 |
| 22.10.2015 03:00 - 04:00 | 0 | 0 | 0 | 0 |
| 22.10.2015 04:00 - 05:00 | 0 | 0 | 0 | 0 |
| 22.10.2015 05:00 - 06:00 | 0 | 0 | 0 | 0 |
| 22.10.2015 06:00 - 07:00 | 0 | 0 | 0 | 0 |
| 22.10.2015 07:00 - 08:00 | 0 | 0 | 0 | 0 |
| 22.10.2015 08:00 - 09:00 | 0 | 0 | 0 | 0 |
| 22.10.2015 09:00 - 10:00 | 0 | 0 | 0 | 0 |
| 22.10.2015 10:00 - 11:00 | 0 | 0 | 0 | 0 |
| 22.10.2015 11:00 - 12:00 | 0 | 0 | 0 | 0 |
| 22.10.2015 12:00 - 13:00 | 0 | 0 | 0 | 0 |
| 22.10.2015 13:00 - 14:00 | 0 | 0 | 0 | 0 |
| 22.10.2015 14:00 - 15:00 | 0 | 0 | 0 | 0 |
| 22.10.2015 15:00 - 16:00 | 0 | 0 | 0 | 0 |
| 22.10.2015 16:00 - 17:00 | 0 | 0 | 0 | 0 |
| 22.10.2015 17:00 - 18:00 | 0 | 0 | 0 | 0 |
| 22.10.2015 18:00 - 19:00 | 0 | 0 | 0 | 0 |
| 22.10.2015 19:00 - 20:00 | 0 | 0 | 0 | 0 |
| 22.10.2015 20:00 - 21:00 | 0 | 0 | 0 | 0 |
| 22.10.2015 21:00 - 22:00 | 0 | 0 | 0 | 0 |
| 22.10.2015 22:00 - 23:00 | 0 | 0 | 0 | 0 |
| 22.10.2015 23:00 - 24:00 | 0 | 0 | 0 | 0 |
| 23.10.2015 00:00 - 01:00 | 0 | 0 | 0 | 0 |
| 23.10.2015 01:00 - 02:00 | 0 | 0 | 0 | 0 |
| 23.10.2015 02:00 - 03:00 | 0 | 0 | 0 | 0 |
| 23.10.2015 03:00 - 04:00 | 0 | 0 | 0 | 0 |
| 23.10.2015 04:00 - 05:00 | 0 | 0 | 0 | 0 |
| 23.10.2015 05:00 - 06:00 | 0 | 0 | 0 | 0 |
| 23.10.2015 06:00 - 07:00 | 0 | 0 | 0 | 0 |
| 23.10.2015 07:00 - 08:00 | 0 | 0 | 0 | 0 |
| 23.10.2015 08:00 - 09:00 | 0 | 0 | 0 | 0 |
| 23.10.2015 09:00 - 10:00 | 0 | 0 | 0 | 0 |
| 23.10.2015 10:00 - 11:00 | 0 | 0 | 0 | 0 |
| 23.10.2015 11:00 - 12:00 | 0 | 0 | 0 | 0 |
| 23.10.2015 12:00 - 13:00 | 0 | 0 | 0 | 0 |
| 23.10.2015 13:00 - 14:00 | 0 | 0 | 0 | 0 |
| 23.10.2015 14:00 - 15:00 | 0 | 0 | 0 | 0 |
| 23.10.2015 15:00 - 16:00 | 0 | 0 | 0 | 0 |
| 23.10.2015 16:00 - 17:00 | 0 | 0 | 0 | 0 |
| 23.10.2015 17:00 - 18:00 | 0 | 0 | 0 | 0 |
| 23.10.2015 18:00 - 19:00 | 0 | 0 | 0 | 0 |
| 23.10.2015 19:00 - 20:00 | 0 | 0 | 0 | 0 |
| 23.10.2015 20:00 - 21:00 | 0 | 0 | 0 | 0 |
| 23.10.2015 21:00 - 22:00 | 0 | 0 | 0 | 0 |
| 23.10.2015 22:00 - 23:00 | 0 | 0 | 0 | 0 |
| 23.10.2015 23:00 - 24:00 | 0 | 0 | 0 | 0 |
| 24.10.2015 00:00 - 01:00 | 0 | 0 | 0 | 0 |
| 24.10.2015 01:00 - 02:00 | 0 | 0 | 0 | 0 |
| 24.10.2015 02:00 - 03:00 | 0 | -60 | 0 | 0 |
| 24.10.2015 03:00 - 04:00 | 0 | -60 | 0 | 0 |
| 24.10.2015 04:00 - 05:00 | 0 | -60 | 0 | 0 |
| 24.10.2015 05:00 - 06:00 | 0 | -60 | 0 | 0 |
| 24.10.2015 06:00 - 07:00 | 0 | 0 | 0 | 0 |
| 24.10.2015 07:00 - 08:00 | 0 | 0 | 0 | 0 |
| 24.10.2015 08:00 - 09:00 | 0 | 0 | 0 | 0 |
| 24.10.2015 09:00 - 10:00 | 0 | 0 | 0 | 0 |
| 24.10.2015 10:00 - 11:00 | 0 | 0 | 0 | 0 |
| 24.10.2015 11:00 - 12:00 | 0 | 0 | 0 | 0 |
| 24.10.2015 12:00 - 13:00 | 0 | 0 | 0 | 0 |
| 24.10.2015 13:00 - 14:00 | 0 | 0 | 0 | 0 |
| 24.10.2015 14:00 - 15:00 | 0 | 0 | 0 | 0 |
| 24.10.2015 15:00 - 16:00 | 0 | 0 | 0 | 0 |
| 24.10.2015 16:00 - 17:00 | 0 | 0 | 0 | 0 |
| 24.10.2015 17:00 - 18:00 | 0 | 0 | 0 | 0 |
| 24.10.2015 18:00 - 19:00 | 0 | 0 | 0 | 0 |
| 24.10.2015 19:00 - 20:00 | 0 | 0 | 0 | 0 |
| 24.10.2015 20:00 - 21:00 | 0 | 0 | 0 | 0 |
| 24.10.2015 21:00 - 22:00 | 0 | 0 | 0 | 0 |
| 24.10.2015 22:00 - 23:00 | 0 | 0 | 0 | 0 |
| 24.10.2015 23:00 - 24:00 | 0 | 0 | 0 | 0 |
| 25.10.2015 00:00 - 01:00 | 0 | 0 | 0 | 0 |
| 25.10.2015 01:00 - 02:00 | 0 | 0 | 0 | 0 |
| 25.10.2015 02:00 - 02:00 | 0 | 0 | 0 | 0 |
| 25.10.2015 02:00 - 03:00 | 0 | 0 | 0 | 0 |
| 25.10.2015 03:00 - 04:00 | 0 | 0 | 0 | 0 |
| 25.10.2015 04:00 - 05:00 | 0 | 0 | 0 | 0 |
| 25.10.2015 05:00 - 06:00 | 0 | 0 | 0 | 0 |
| 25.10.2015 06:00 - 07:00 | 0 | 0 | 0 | 0 |
| 25.10.2015 07:00 - 08:00 | 0 | 0 | 0 | 0 |
| 25.10.2015 08:00 - 09:00 | 0 | 0 | 0 | 0 |
| 25.10.2015 09:00 - 10:00 | 0 | 0 | 0 | 0 |
| 25.10.2015 10:00 - 11:00 | 0 | 0 | 0 | 0 |
| 25.10.2015 11:00 - 12:00 | 0 | 0 | 0 | 0 |
| 25.10.2015 12:00 - 13:00 | 0 | 0 | 0 | 0 |
| 25.10.2015 13:00 - 14:00 | 0 | 0 | 0 | 0 |
| 25.10.2015 14:00 - 15:00 | 0 | 0 | 0 | 0 |
| 25.10.2015 15:00 - 16:00 | 0 | 0 | 0 | 0 |
| 25.10.2015 16:00 - 17:00 | 0 | 0 | 0 | 0 |
| 25.10.2015 17:00 - 18:00 | 0 | 0 | 0 | 0 |
| 25.10.2015 18:00 - 19:00 | 0 | 0 | 0 | 0 |
| 25.10.2015 19:00 - 20:00 | 0 | 0 | 0 | 0 |
| 25.10.2015 20:00 - 21:00 | 0 | 0 | 0 | 0 |
| 25.10.2015 21:00 - 22:00 | 0 | 0 | 0 | 0 |
| 25.10.2015 22:00 - 23:00 | 0 | -60 | 0 | 0 |
| 25.10.2015 23:00 - 24:00 | 0 | -60 | 0 | 0 |
| 26.10.2015 00:00 - 01:00 | 0 | -60 | 0 | 0 |
| 26.10.2015 01:00 - 02:00 | 0 | -60 | 0 | 0 |
| 26.10.2015 02:00 - 03:00 | 0 | -60 | 0 | 0 |
| 26.10.2015 03:00 - 04:00 | 0 | -60 | 0 | 0 |
| 26.10.2015 04:00 - 05:00 | 0 | -60 | 0 | 0 |
| 26.10.2015 05:00 - 06:00 | 0 | -60 | 0 | 0 |
| 26.10.2015 06:00 - 07:00 | 0 | 0 | 0 | 0 |
| 26.10.2015 07:00 - 08:00 | 0 | 0 | 0 | 0 |
| 26.10.2015 08:00 - 09:00 | 0 | 0 | 0 | 0 |
| 26.10.2015 09:00 - 10:00 | 0 | 0 | 0 | 0 |
| 26.10.2015 10:00 - 11:00 | 0 | 0 | 0 | 0 |
| 26.10.2015 11:00 - 12:00 | 0 | 0 | 0 | 0 |
| 26.10.2015 12:00 - 13:00 | 0 | 0 | 0 | 0 |
| 26.10.2015 13:00 - 14:00 | 0 | 0 | 0 | 0 |
| 26.10.2015 14:00 - 15:00 | 0 | 0 | 0 | 0 |
| 26.10.2015 15:00 - 16:00 | 0 | 0 | 0 | 0 |
| 26.10.2015 16:00 - 17:00 | 0 | 0 | 0 | 0 |
| 26.10.2015 17:00 - 18:00 | 0 | 0 | 0 | 0 |
| 26.10.2015 18:00 - 19:00 | 0 | 0 | 0 | 0 |
| 26.10.2015 19:00 - 20:00 | 0 | 0 | 0 | 0 |
| 26.10.2015 20:00 - 21:00 | 0 | 0 | 0 | 0 |
| 26.10.2015 21:00 - 22:00 | 0 | 0 | 0 | 0 |
| 26.10.2015 22:00 - 23:00 | 0 | 0 | 0 | 0 |
| 26.10.2015 23:00 - 24:00 | 0 | 0 | 0 | 0 |
| 27.10.2015 00:00 - 01:00 | 0 | 0 | 0 | 0 |
| 27.10.2015 01:00 - 02:00 | 0 | 0 | 0 | 0 |
| 27.10.2015 02:00 - 03:00 | 0 | 0 | 0 | 0 |
| 27.10.2015 03:00 - 04:00 | 0 | 0 | 0 | 0 |
| 27.10.2015 04:00 - 05:00 | 0 | 0 | 0 | 0 |
| 27.10.2015 05:00 - 06:00 | 0 | 0 | 0 | 0 |
| 27.10.2015 06:00 - 07:00 | 0 | 0 | 0 | 0 |
| 27.10.2015 07:00 - 08:00 | 0 | 0 | 0 | 0 |
| 27.10.2015 08:00 - 09:00 | 0 | 0 | 0 | 0 |
| 27.10.2015 09:00 - 10:00 | 0 | 0 | 0 | 0 |
| 27.10.2015 10:00 - 11:00 | 0 | 0 | 0 | 0 |
| 27.10.2015 11:00 - 12:00 | 0 | 0 | 0 | 0 |
| 27.10.2015 12:00 - 13:00 | 0 | 0 | 0 | 0 |
| 27.10.2015 13:00 - 14:00 | 0 | 0 | 0 | 0 |
| 27.10.2015 14:00 - 15:00 | 0 | 0 | 0 | 0 |
| 27.10.2015 15:00 - 16:00 | 0 | 0 | 0 | 0 |
| 27.10.2015 16:00 - 17:00 | 0 | 0 | 0 | 0 |
| 27.10.2015 17:00 - 18:00 | 0 | 0 | 0 | 0 |
| 27.10.2015 18:00 - 19:00 | 0 | 0 | 0 | 0 |
| 27.10.2015 19:00 - 20:00 | 0 | 0 | 0 | 0 |
| 27.10.2015 20:00 - 21:00 | 0 | 0 | 0 | 0 |
| 27.10.2015 21:00 - 22:00 | 0 | 0 | 0 | 0 |
| 27.10.2015 22:00 - 23:00 | 0 | 0 | 0 | 0 |
| 27.10.2015 23:00 - 24:00 | 0 | 0 | 0 | 0 |
| 28.10.2015 00:00 - 01:00 | 0 | 0 | 0 | 0 |
| 28.10.2015 01:00 - 02:00 | 0 | 0 | 0 | 0 |
| 28.10.2015 02:00 - 03:00 | 0 | 0 | 0 | 0 |
| 28.10.2015 03:00 - 04:00 | 0 | 0 | 0 | 0 |
| 28.10.2015 04:00 - 05:00 | 0 | 0 | 0 | 0 |
| 28.10.2015 05:00 - 06:00 | 0 | 0 | 0 | 0 |
| 28.10.2015 06:00 - 07:00 | 0 | 0 | 0 | 0 |
| 28.10.2015 07:00 - 08:00 | 0 | 0 | 0 | 0 |
| 28.10.2015 08:00 - 09:00 | 0 | 0 | 0 | 0 |
| 28.10.2015 09:00 - 10:00 | 0 | 0 | 0 | 0 |
| 28.10.2015 10:00 - 11:00 | 0 | 0 | 0 | 0 |
| 28.10.2015 11:00 - 12:00 | 0 | 0 | 0 | 0 |
| 28.10.2015 12:00 - 13:00 | 0 | 0 | 0 | 0 |
| 28.10.2015 13:00 - 14:00 | 0 | 0 | 0 | 0 |
| 28.10.2015 14:00 - 15:00 | 0 | 0 | 0 | 0 |
| 28.10.2015 15:00 - 16:00 | 0 | 0 | 0 | 0 |
| 28.10.2015 16:00 - 17:00 | 0 | 0 | 0 | 0 |
| 28.10.2015 17:00 - 18:00 | 0 | 0 | 0 | 0 |
| 28.10.2015 18:00 - 19:00 | 0 | 0 | 0 | 0 |
| 28.10.2015 19:00 - 20:00 | 0 | 0 | 0 | 0 |
| 28.10.2015 20:00 - 21:00 | 0 | 0 | 0 | 0 |
| 28.10.2015 21:00 - 22:00 | 0 | 0 | 0 | 0 |
| 28.10.2015 22:00 - 23:00 | 0 | 0 | 0 | 0 |
| 28.10.2015 23:00 - 24:00 | 0 | 0 | 0 | 0 |
| 29.10.2015 00:00 - 01:00 | 0 | 0 | 0 | 0 |
| 29.10.2015 01:00 - 02:00 | 0 | 0 | 0 | 0 |
| 29.10.2015 02:00 - 03:00 | 0 | 0 | 0 | 0 |
| 29.10.2015 03:00 - 04:00 | 0 | 0 | 0 | 0 |
| 29.10.2015 04:00 - 05:00 | 0 | 0 | 0 | 0 |
| 29.10.2015 05:00 - 06:00 | 0 | 0 | 0 | 0 |
| 29.10.2015 06:00 - 07:00 | 0 | 0 | 0 | 0 |
| 29.10.2015 07:00 - 08:00 | 0 | 0 | 0 | 0 |
| 29.10.2015 08:00 - 09:00 | 0 | 0 | 0 | 0 |
| 29.10.2015 09:00 - 10:00 | 0 | 0 | 0 | 0 |
| 29.10.2015 10:00 - 11:00 | 0 | 0 | 0 | 0 |
| 29.10.2015 11:00 - 12:00 | 0 | 0 | 0 | 0 |
| 29.10.2015 12:00 - 13:00 | 0 | 0 | 0 | 0 |
| 29.10.2015 13:00 - 14:00 | 0 | 0 | 0 | 0 |
| 29.10.2015 14:00 - 15:00 | 0 | 0 | 0 | 0 |
| 29.10.2015 15:00 - 16:00 | 0 | 0 | 0 | 0 |
| 29.10.2015 16:00 - 17:00 | 0 | 0 | 0 | 0 |
| 29.10.2015 17:00 - 18:00 | 0 | 0 | 0 | 0 |
| 29.10.2015 18:00 - 19:00 | 0 | 0 | 0 | 0 |
| 29.10.2015 19:00 - 20:00 | 0 | 0 | 0 | 0 |
| 29.10.2015 20:00 - 21:00 | 60 | 0 | 0 | 0 |
| 29.10.2015 21:00 - 22:00 | 60 | 0 | 0 | 0 |
| 29.10.2015 22:00 - 23:00 | 60 | 0 | 0 | 0 |
| 29.10.2015 23:00 - 24:00 | 60 | 0 | 0 | 0 |
| 30.10.2015 00:00 - 01:00 | 60 | 0 | 0 | 0 |
| 30.10.2015 01:00 - 02:00 | 60 | 0 | 0 | 0 |
| 30.10.2015 02:00 - 03:00 | 60 | 0 | 0 | 0 |
| 30.10.2015 03:00 - 04:00 | 60 | 0 | 0 | 0 |
| 30.10.2015 04:00 - 05:00 | 60 | 0 | 0 | 0 |
| 30.10.2015 05:00 - 06:00 | 60 | 0 | 0 | 0 |
| 30.10.2015 06:00 - 07:00 | 0 | 0 | 0 | 0 |
| 30.10.2015 07:00 - 08:00 | 0 | 0 | 0 | 0 |
| 30.10.2015 08:00 - 09:00 | 0 | 0 | 0 | 0 |
| 30.10.2015 09:00 - 10:00 | 0 | 0 | 0 | 0 |
| 30.10.2015 10:00 - 11:00 | 0 | 0 | 0 | 0 |
| 30.10.2015 11:00 - 12:00 | 0 | 0 | 0 | 0 |
| 30.10.2015 12:00 - 13:00 | 0 | 0 | 0 | 0 |
| 30.10.2015 13:00 - 14:00 | 0 | 0 | 0 | 0 |
| 30.10.2015 14:00 - 15:00 | 0 | 0 | 0 | 0 |
| 30.10.2015 15:00 - 16:00 | 0 | 0 | 0 | 0 |
| 30.10.2015 16:00 - 17:00 | 0 | 0 | 0 | 0 |
| 30.10.2015 17:00 - 18:00 | 0 | 0 | 0 | 0 |
| 30.10.2015 18:00 - 19:00 | 0 | 0 | 0 | 0 |
| 30.10.2015 19:00 - 20:00 | 0 | 0 | 0 | 0 |
| 30.10.2015 20:00 - 21:00 | 50 | 0 | 0 | 0 |
| 30.10.2015 21:00 - 22:00 | 50 | 0 | 0 | 0 |
| 30.10.2015 22:00 - 23:00 | 50 | 0 | 0 | 0 |
| 30.10.2015 23:00 - 24:00 | 50 | 0 | 0 | 0 |
| 31.10.2015 00:00 - 01:00 | 50 | 0 | 0 | 0 |
| 31.10.2015 01:00 - 02:00 | 170 | 0 | 0 | 0 |
| 31.10.2015 02:00 - 03:00 | 170 | 0 | 0 | 0 |
| 31.10.2015 03:00 - 04:00 | 170 | 0 | 0 | 0 |
| 31.10.2015 04:00 - 05:00 | 170 | 0 | 0 | 0 |
| 31.10.2015 05:00 - 06:00 | 170 | 0 | 0 | 0 |
| 31.10.2015 06:00 - 07:00 | 0 | 0 | 0 | 0 |